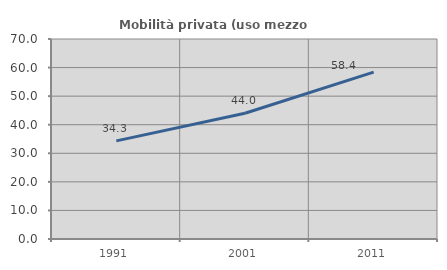
| Category | Mobilità privata (uso mezzo privato) |
|---|---|
| 1991.0 | 34.345 |
| 2001.0 | 44.031 |
| 2011.0 | 58.389 |